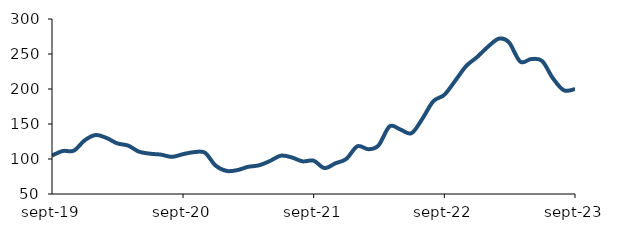
| Category | Series 0 |
|---|---|
| 2019-09-01 | 104.835 |
| 2019-10-01 | 111.409 |
| 2019-11-01 | 111.925 |
| 2019-12-01 | 126.529 |
| 2020-01-01 | 134.255 |
| 2020-02-01 | 129.901 |
| 2020-03-01 | 122.394 |
| 2020-04-01 | 119.057 |
| 2020-05-01 | 110.456 |
| 2020-06-01 | 107.554 |
| 2020-07-01 | 106.253 |
| 2020-08-01 | 103.049 |
| 2020-09-01 | 106.902 |
| 2020-10-01 | 109.711 |
| 2020-11-01 | 109.011 |
| 2020-12-01 | 90.634 |
| 2021-01-01 | 82.908 |
| 2021-02-01 | 84.275 |
| 2021-03-01 | 88.757 |
| 2021-04-01 | 90.964 |
| 2021-05-01 | 96.958 |
| 2021-06-01 | 104.739 |
| 2021-07-01 | 102.396 |
| 2021-08-01 | 96.652 |
| 2021-09-01 | 97.59 |
| 2021-10-01 | 87.03 |
| 2021-11-01 | 93.888 |
| 2021-12-01 | 100.079 |
| 2022-01-01 | 118.131 |
| 2022-02-01 | 113.977 |
| 2022-03-01 | 119.323 |
| 2022-04-01 | 146.553 |
| 2022-05-01 | 142.197 |
| 2022-06-01 | 136.794 |
| 2022-07-01 | 156.982 |
| 2022-08-01 | 182.397 |
| 2022-09-01 | 191.729 |
| 2022-10-01 | 211.533 |
| 2022-11-01 | 232.804 |
| 2022-12-01 | 245.403 |
| 2023-01-01 | 260.441 |
| 2023-02-01 | 272.004 |
| 2023-03-01 | 266.361 |
| 2023-04-01 | 239.025 |
| 2023-05-01 | 242.673 |
| 2023-06-01 | 240.105 |
| 2023-07-01 | 215.499 |
| 2023-08-01 | 198.123 |
| 2023-09-01 | 199.949 |